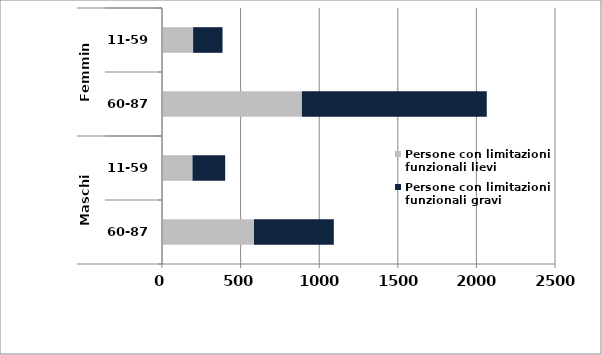
| Category | Persone con limitazioni funzionali lievi | Persone con limitazioni funzionali gravi |
|---|---|---|
| 0 | 585 | 508 |
| 1900-01-01 | 194 | 208 |
| 1900-01-02 | 890 | 1176 |
| 1900-01-03 | 198 | 187 |